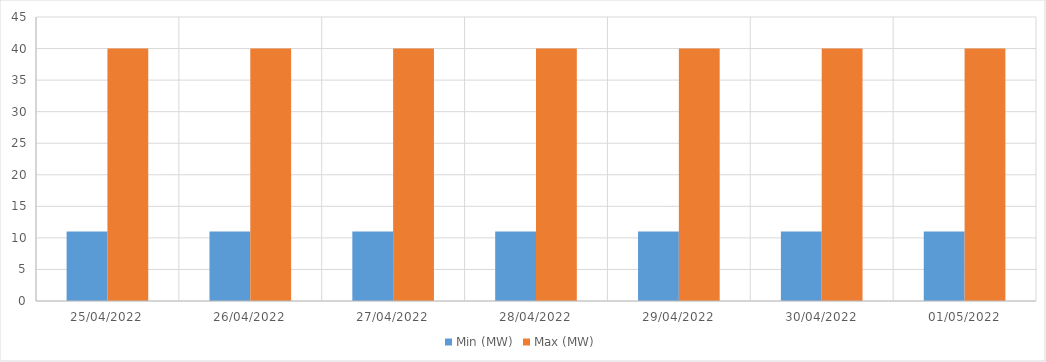
| Category | Min (MW) | Max (MW) |
|---|---|---|
| 25/04/2022 | 11 | 40 |
| 26/04/2022 | 11 | 40 |
| 27/04/2022 | 11 | 40 |
| 28/04/2022 | 11 | 40 |
| 29/04/2022 | 11 | 40 |
| 30/04/2022 | 11 | 40 |
| 01/05/2022 | 11 | 40 |